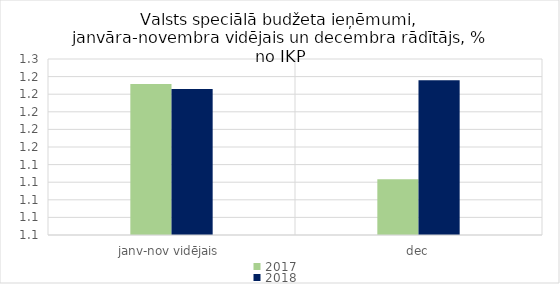
| Category | 2017 | 2018 |
|---|---|---|
| janv-nov vidējais | 1.221 | 1.216 |
| dec | 1.113 | 1.226 |